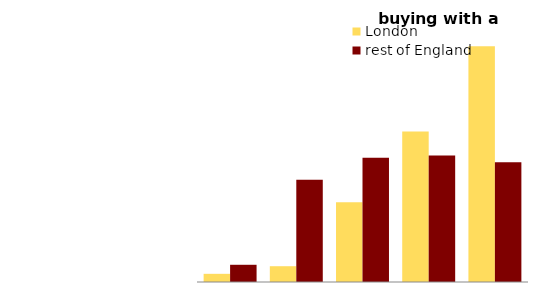
| Category | London | rest of England |
|---|---|---|
| first quintile (lowest) | 1.668 | 3.514 |
| second quintile | 3.224 | 20.869 |
| third quintile | 16.283 | 25.349 |
| fourth quintile | 30.711 | 25.834 |
| fifth quintile (highest) | 48.115 | 24.433 |